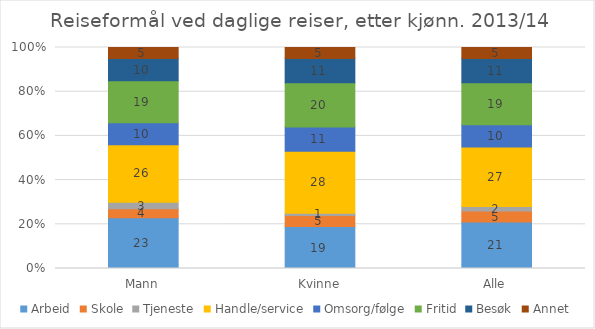
| Category | Arbeid | Skole | Tjeneste | Handle/service | Omsorg/følge | Fritid | Besøk | Annet |
|---|---|---|---|---|---|---|---|---|
| Mann | 23 | 4 | 3 | 26 | 10 | 19 | 10 | 5 |
| Kvinne | 19 | 5 | 1 | 28 | 11 | 20 | 11 | 5 |
| Alle | 21 | 5 | 2 | 27 | 10 | 19 | 11 | 5 |